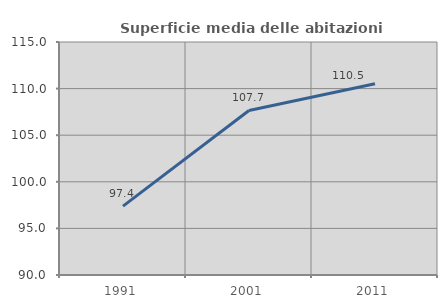
| Category | Superficie media delle abitazioni occupate |
|---|---|
| 1991.0 | 97.387 |
| 2001.0 | 107.651 |
| 2011.0 | 110.525 |